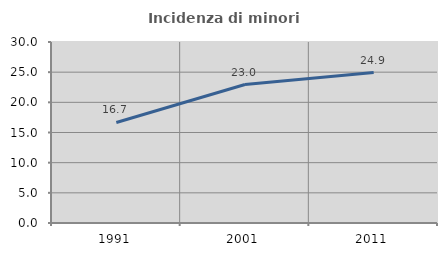
| Category | Incidenza di minori stranieri |
|---|---|
| 1991.0 | 16.667 |
| 2001.0 | 22.951 |
| 2011.0 | 24.928 |